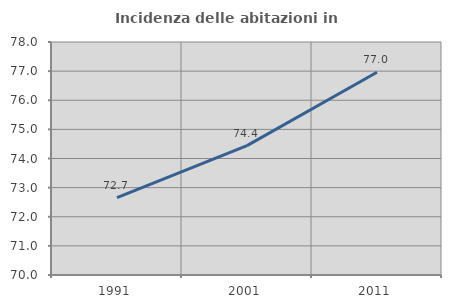
| Category | Incidenza delle abitazioni in proprietà  |
|---|---|
| 1991.0 | 72.655 |
| 2001.0 | 74.44 |
| 2011.0 | 76.961 |